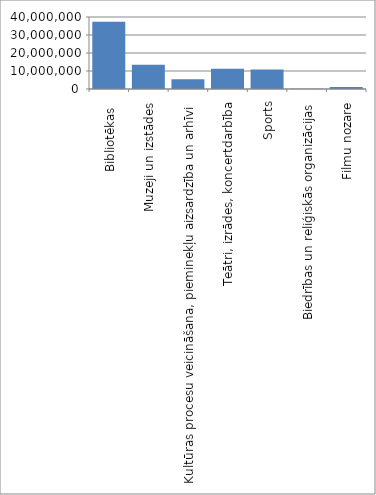
| Category | Series 0 |
|---|---|
|  Bibliotēkas  | 37375932 |
| Muzeji un izstādes | 13429973 |
| Kultūras procesu veicināšana, pieminekļu aizsardzība un arhīvi  | 5375347 |
| Teātri, izrādes, koncertdarbība | 11248100 |
| Sports | 10802535 |
| Biedrības un reliģiskās organizācijas | 151306 |
| Filmu nozare | 1044010 |